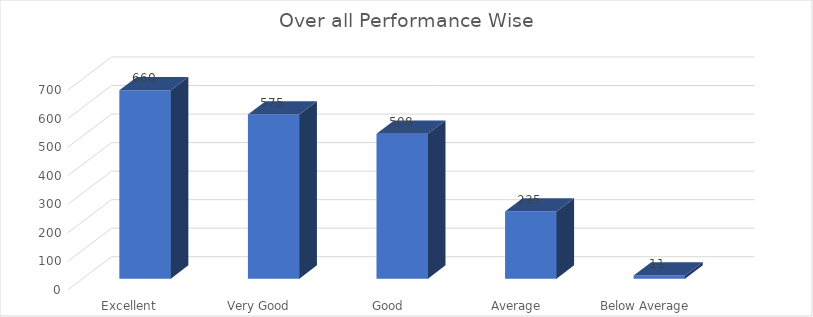
| Category | Series 0 |
|---|---|
| Excellent  | 660 |
| Very Good | 575 |
| Good | 508 |
| Average | 235 |
| Below Average | 11 |